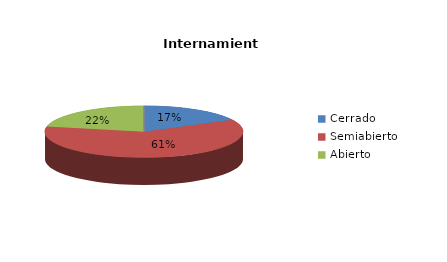
| Category | Series 0 |
|---|---|
| Cerrado | 4 |
| Semiabierto | 14 |
| Abierto | 5 |
| Terapeúticos | 0 |